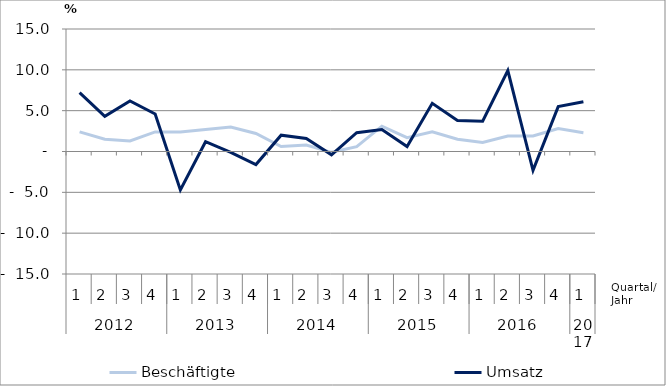
| Category | Beschäftigte | Umsatz |
|---|---|---|
| 0 | 2.4 | 7.2 |
| 1 | 1.5 | 4.3 |
| 2 | 1.3 | 6.2 |
| 3 | 2.4 | 4.6 |
| 4 | 2.4 | -4.7 |
| 5 | 2.7 | 1.2 |
| 6 | 3 | -0.1 |
| 7 | 2.2 | -1.6 |
| 8 | 0.6 | 2 |
| 9 | 0.8 | 1.6 |
| 10 | -0.1 | -0.4 |
| 11 | 0.6 | 2.3 |
| 12 | 3.1 | 2.7 |
| 13 | 1.7 | 0.6 |
| 14 | 2.4 | 5.9 |
| 15 | 1.5 | 3.8 |
| 16 | 1.1 | 3.7 |
| 17 | 1.9 | 9.9 |
| 18 | 1.9 | -2.3 |
| 19 | 2.8 | 5.5 |
| 20 | 2.3 | 6.1 |